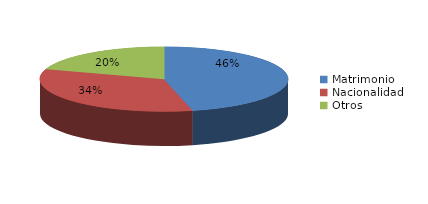
| Category | Series 0 |
|---|---|
| Matrimonio | 4573 |
| Nacionalidad | 3326 |
| Otros | 1972 |